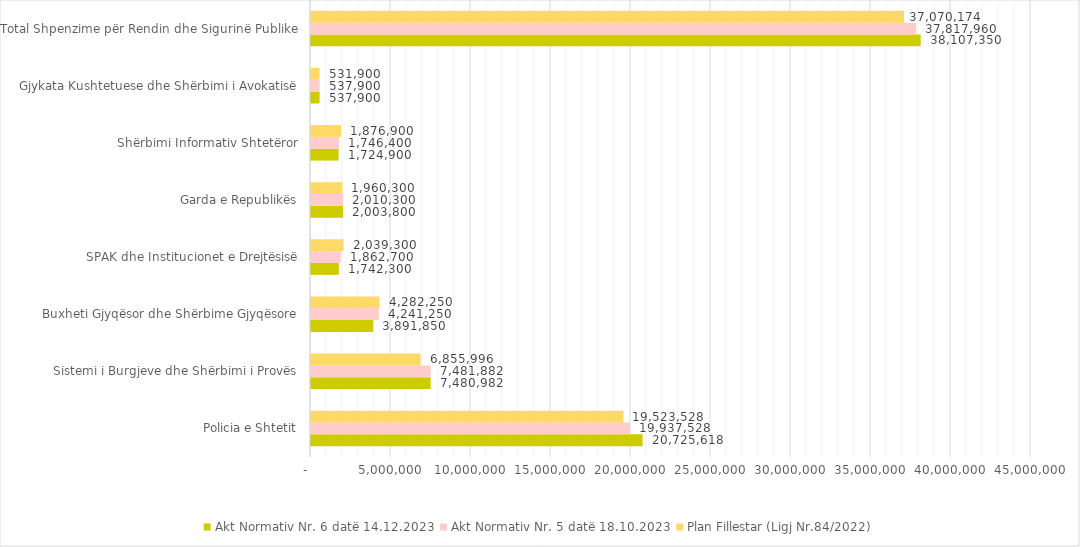
| Category | Akt Normativ Nr. 6 datë 14.12.2023 | Akt Normativ Nr. 5 datë 18.10.2023 | Plan Fillestar (Ligj Nr.84/2022) |
|---|---|---|---|
| Policia e Shtetit | 20725618 | 19937528 | 19523528 |
| Sistemi i Burgjeve dhe Shërbimi i Provës | 7480982 | 7481882 | 6855996 |
| Buxheti Gjyqësor dhe Shërbime Gjyqësore | 3891850 | 4241250 | 4282250 |
| SPAK dhe Institucionet e Drejtësisë | 1742300 | 1862700 | 2039300 |
| Garda e Republikës | 2003800 | 2010300 | 1960300 |
| Shërbimi Informativ Shtetëror | 1724900 | 1746400 | 1876900 |
| Gjykata Kushtetuese dhe Shërbimi i Avokatisë | 537900 | 537900 | 531900 |
| Total Shpenzime për Rendin dhe Sigurinë Publike | 38107350 | 37817960 | 37070174 |